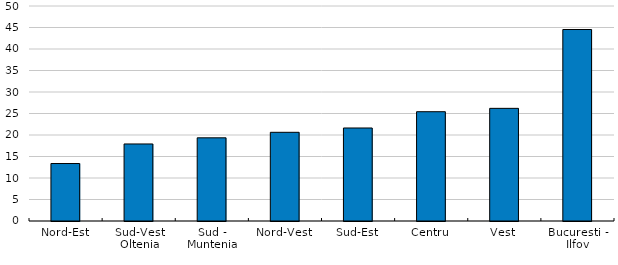
| Category | Series1 |
|---|---|
| Nord-Est | 13.367 |
| Sud-Vest Oltenia | 17.918 |
| Sud - Muntenia | 19.346 |
| Nord-Vest | 20.627 |
| Sud-Est | 21.63 |
| Centru | 25.415 |
| Vest | 26.197 |
| Bucuresti - Ilfov | 44.534 |